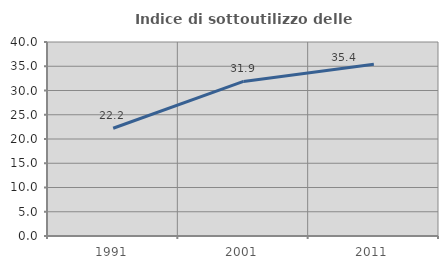
| Category | Indice di sottoutilizzo delle abitazioni  |
|---|---|
| 1991.0 | 22.222 |
| 2001.0 | 31.868 |
| 2011.0 | 35.407 |